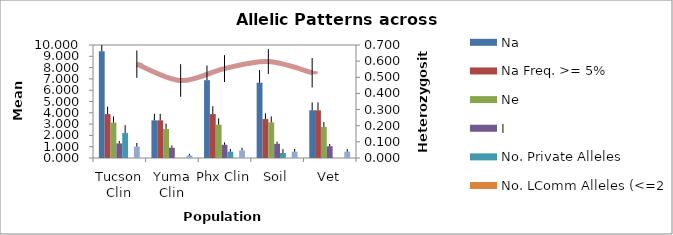
| Category | Na | Na Freq. >= 5% | Ne | I | No. Private Alleles | No. LComm Alleles (<=25%) | No. LComm Alleles (<=50%) |
|---|---|---|---|---|---|---|---|
| Tucson Clin | 9.444 | 3.889 | 3.139 | 1.288 | 2.222 | 0 | 1 |
| Yuma Clin | 3.333 | 3.333 | 2.568 | 0.905 | 0 | 0 | 0.222 |
| Phx Clin | 6.889 | 3.889 | 2.952 | 1.169 | 0.556 | 0 | 0.667 |
| Soil | 6.667 | 3.444 | 3.155 | 1.257 | 0.444 | 0 | 0.556 |
| Vet | 4.222 | 4.222 | 2.748 | 1.044 | 0 | 0 | 0.556 |